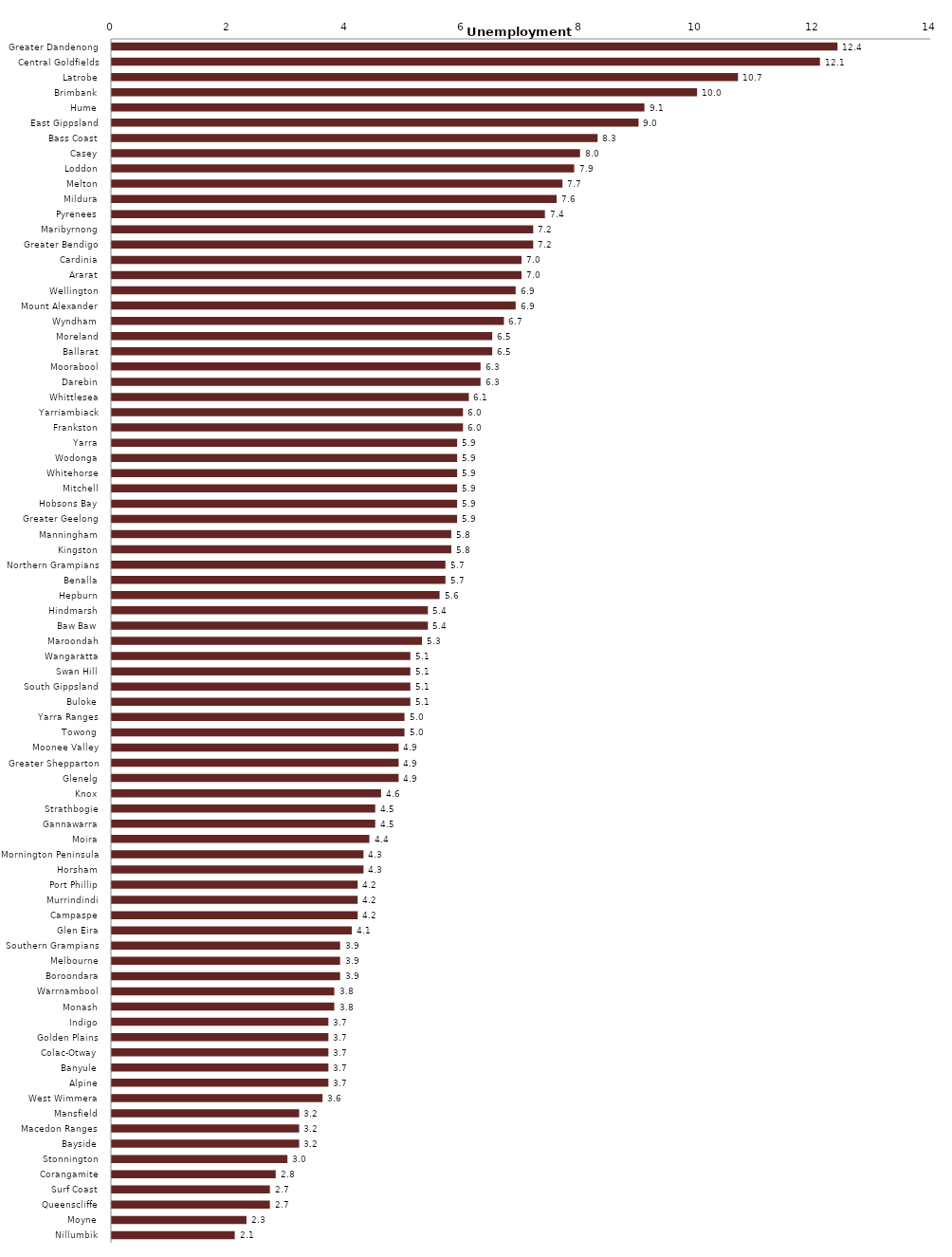
| Category | Series 0 |
|---|---|
| Greater Dandenong  | 12.4 |
| Central Goldfields  | 12.1 |
| Latrobe  | 10.7 |
| Brimbank  | 10 |
| Hume  | 9.1 |
| East Gippsland  | 9 |
| Bass Coast  | 8.3 |
| Casey  | 8 |
| Loddon  | 7.9 |
| Melton  | 7.7 |
| Mildura  | 7.6 |
| Pyrenees  | 7.4 |
| Maribyrnong  | 7.2 |
| Greater Bendigo  | 7.2 |
| Cardinia  | 7 |
| Ararat  | 7 |
| Wellington  | 6.9 |
| Mount Alexander  | 6.9 |
| Wyndham  | 6.7 |
| Moreland  | 6.5 |
| Ballarat  | 6.5 |
| Moorabool  | 6.3 |
| Darebin  | 6.3 |
| Whittlesea  | 6.1 |
| Yarriambiack  | 6 |
| Frankston  | 6 |
| Yarra  | 5.9 |
| Wodonga  | 5.9 |
| Whitehorse  | 5.9 |
| Mitchell  | 5.9 |
| Hobsons Bay  | 5.9 |
| Greater Geelong  | 5.9 |
| Manningham  | 5.8 |
| Kingston  | 5.8 |
| Northern Grampians  | 5.7 |
| Benalla  | 5.7 |
| Hepburn  | 5.6 |
| Hindmarsh  | 5.4 |
| Baw Baw  | 5.4 |
| Maroondah  | 5.3 |
| Wangaratta  | 5.1 |
| Swan Hill  | 5.1 |
| South Gippsland  | 5.1 |
| Buloke  | 5.1 |
| Yarra Ranges  | 5 |
| Towong  | 5 |
| Moonee Valley  | 4.9 |
| Greater Shepparton  | 4.9 |
| Glenelg  | 4.9 |
| Knox  | 4.6 |
| Strathbogie  | 4.5 |
| Gannawarra  | 4.5 |
| Moira  | 4.4 |
| Mornington Peninsula  | 4.3 |
| Horsham  | 4.3 |
| Port Phillip  | 4.2 |
| Murrindindi  | 4.2 |
| Campaspe  | 4.2 |
| Glen Eira  | 4.1 |
| Southern Grampians  | 3.9 |
| Melbourne  | 3.9 |
| Boroondara  | 3.9 |
| Warrnambool  | 3.8 |
| Monash  | 3.8 |
| Indigo  | 3.7 |
| Golden Plains  | 3.7 |
| Colac-Otway  | 3.7 |
| Banyule  | 3.7 |
| Alpine  | 3.7 |
| West Wimmera  | 3.6 |
| Mansfield  | 3.2 |
| Macedon Ranges  | 3.2 |
| Bayside  | 3.2 |
| Stonnington  | 3 |
| Corangamite  | 2.8 |
| Surf Coast  | 2.7 |
| Queenscliffe  | 2.7 |
| Moyne  | 2.3 |
| Nillumbik  | 2.1 |